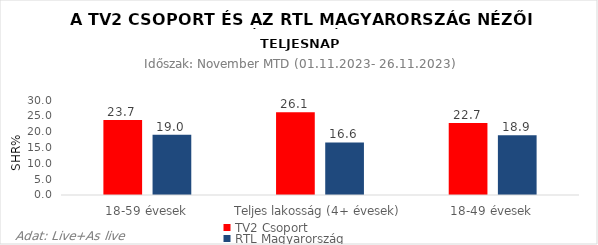
| Category | TV2 Csoport | RTL Magyarország |
|---|---|---|
| 18-59 évesek | 23.7 | 19 |
| Teljes lakosság (4+ évesek) | 26.1 | 16.6 |
| 18-49 évesek | 22.7 | 18.9 |